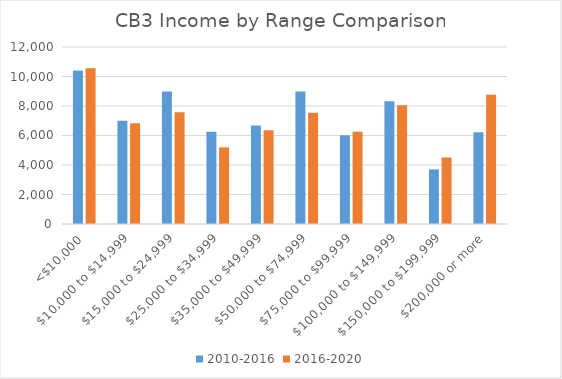
| Category | 2010-2016 | 2016-2020 |
|---|---|---|
| <$10,000 | 10410 | 10551 |
| $10,000 to $14,999 | 7003 | 6835 |
| $15,000 to $24,999 | 8980 | 7570 |
| $25,000 to $34,999 | 6253 | 5199 |
| $35,000 to $49,999 | 6678 | 6361 |
| $50,000 to $74,999 | 8979 | 7536 |
| $75,000 to $99,999 | 6013 | 6257 |
| $100,000 to $149,999 | 8320 | 8057 |
| $150,000 to $199,999 | 3700 | 4509 |
| $200,000 or more | 6223 | 8759 |